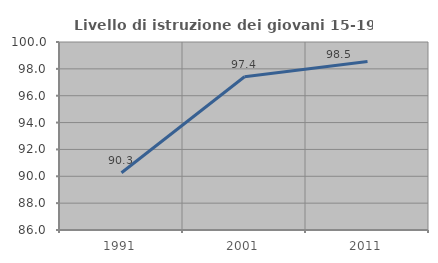
| Category | Livello di istruzione dei giovani 15-19 anni |
|---|---|
| 1991.0 | 90.261 |
| 2001.0 | 97.409 |
| 2011.0 | 98.54 |